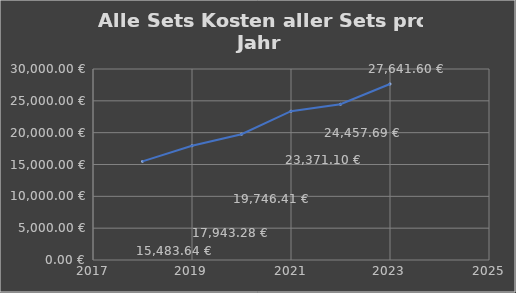
| Category | Alle Sets zusammen Preis |
|---|---|
| 2018.0 | 15483.64 |
| 2019.0 | 17943.28 |
| 2020.0 | 19746.41 |
| 2021.0 | 23371.1 |
| 2022.0 | 24457.69 |
| 2023.0 | 27641.6 |